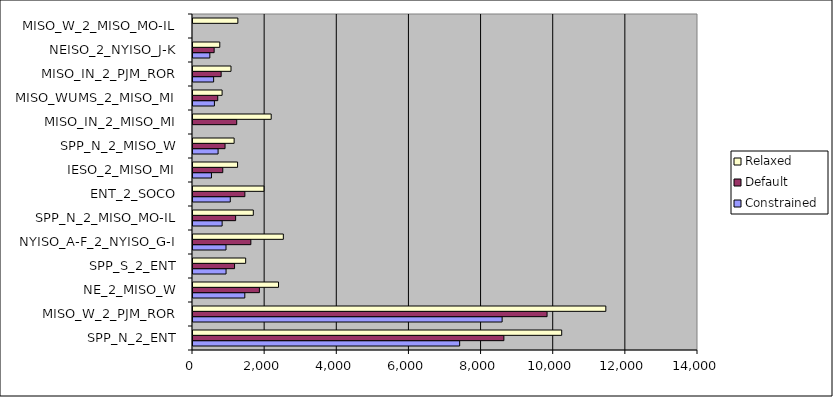
| Category | Constrained | Default | Relaxed |
|---|---|---|---|
| SPP_N_2_ENT | 7392.862 | 8618.577 | 10221.435 |
| MISO_W_2_PJM_ROR | 8569.947 | 9815.673 | 11444.7 |
| NE_2_MISO_W | 1436.134 | 1840.952 | 2370.329 |
| SPP_S_2_ENT | 916.391 | 1151.91 | 1459.896 |
| NYISO_A-F_2_NYISO_G-I | 915.17 | 1603.86 | 2504.454 |
| SPP_N_2_MISO_MO-IL | 807.721 | 1182.083 | 1671.635 |
| ENT_2_SOCO | 1033.418 | 1437.874 | 1966.778 |
| IESO_2_MISO_MI | 511.879 | 825.462 | 1235.534 |
| SPP_N_2_MISO_W | 695.651 | 888.405 | 1140.467 |
| MISO_IN_2_MISO_MI | 0 | 1212.07 | 2167.773 |
| MISO_WUMS_2_MISO_MI | 593.517 | 685.853 | 806.599 |
| MISO_IN_2_PJM_ROR | 571.97 | 780.499 | 1053.191 |
| NEISO_2_NYISO_J-K | 466.706 | 586.267 | 742.615 |
| MISO_W_2_MISO_MO-IL | 0 | 0 | 1243.238 |